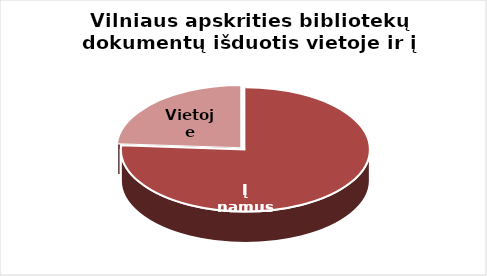
| Category | Series 0 |
|---|---|
| Į namus | 1338121 |
| Vietoje | 421845 |